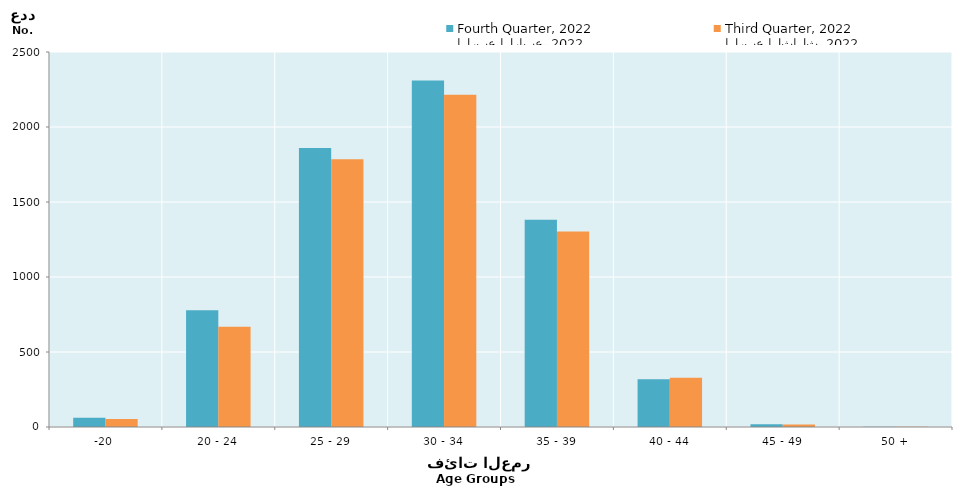
| Category | الربع الرابع، 2022
Fourth Quarter, 2022 | الربع الثالث، 2022
Third Quarter, 2022 |
|---|---|---|
| -20 | 61 | 54 |
| 20 - 24 | 779 | 669 |
| 25 - 29 | 1860 | 1785 |
| 30 - 34 | 2310 | 2215 |
| 35 - 39 | 1381 | 1304 |
| 40 - 44 | 319 | 329 |
| 45 - 49 | 18 | 16 |
| 50 + | 1 | 1 |